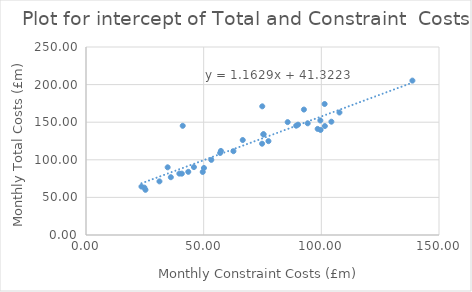
| Category | Total Costs (£m) |
|---|---|
| 25.27 | 60.1 |
| 24.82 | 62.95 |
| 50.12 | 89.12 |
| 39.66 | 81.63 |
| 36.05 | 76.84 |
| 101.5 | 144.84 |
| 104.27 | 150.66 |
| 62.65 | 111.42 |
| 53.25 | 99.9 |
| 40.72 | 81.58 |
| 49.6 | 83.81 |
| 89.31 | 145.34 |
| 43.46 | 84 |
| 23.57 | 64.4 |
| 45.86 | 90.3 |
| 31.21 | 71.3 |
| 57.01 | 109.1 |
| 57.32 | 111.8 |
| 75.42 | 134 |
| 34.7 | 90 |
| 75.41 | 133.7 |
| 94.2 | 148.5 |
| 99.58 | 152.3 |
| 77.53 | 124.8 |
| 66.6 | 126.3 |
| 107.7 | 162.9 |
| 98.44 | 141.1 |
| 99.68 | 139.7 |
| 74.82 | 121.4 |
| 90.1 | 146.7 |
| 85.7 | 150.1 |
| 138.7 | 205.3 |
| 92.6 | 166.8 |
| 41.1 | 145.2 |
| 101.4 | 174.2 |
| 74.9 | 171.1 |